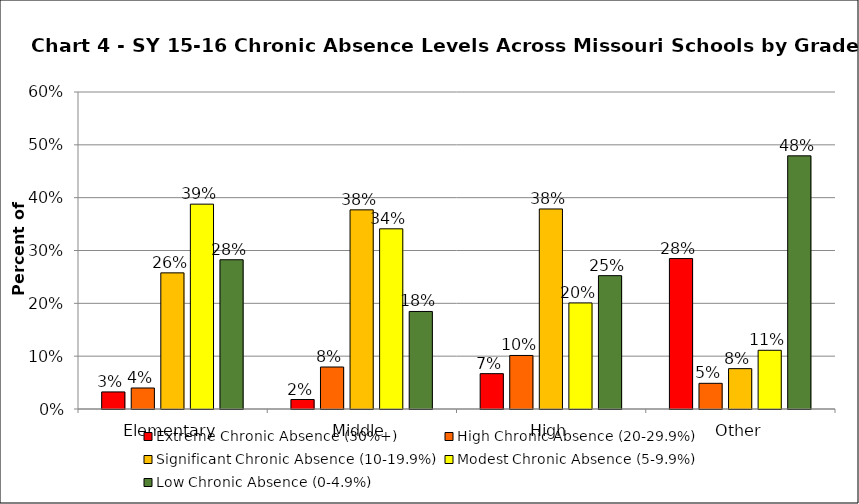
| Category | Extreme Chronic Absence (30%+) | High Chronic Absence (20-29.9%) | Significant Chronic Absence (10-19.9%) | Modest Chronic Absence (5-9.9%) | Low Chronic Absence (0-4.9%) |
|---|---|---|---|---|---|
| 0 | 0.032 | 0.04 | 0.258 | 0.388 | 0.283 |
| 1 | 0.018 | 0.079 | 0.377 | 0.341 | 0.185 |
| 2 | 0.067 | 0.101 | 0.379 | 0.201 | 0.252 |
| 3 | 0.285 | 0.049 | 0.076 | 0.111 | 0.479 |